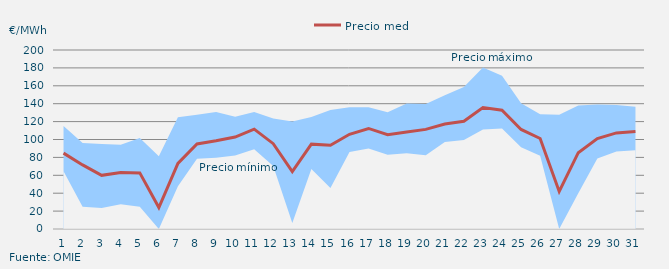
| Category | Precio medio |
|---|---|
| 1.0 | 84.788 |
| 2.0 | 71.594 |
| 3.0 | 59.958 |
| 4.0 | 63.108 |
| 5.0 | 62.688 |
| 6.0 | 24.049 |
| 7.0 | 73.377 |
| 8.0 | 95.079 |
| 9.0 | 98.516 |
| 10.0 | 102.714 |
| 11.0 | 111.58 |
| 12.0 | 95.333 |
| 13.0 | 64.247 |
| 14.0 | 94.796 |
| 15.0 | 93.546 |
| 16.0 | 105.826 |
| 17.0 | 112.348 |
| 18.0 | 105.412 |
| 19.0 | 108.354 |
| 20.0 | 111.321 |
| 21.0 | 117.358 |
| 22.0 | 120.386 |
| 23.0 | 135.603 |
| 24.0 | 132.759 |
| 25.0 | 111.213 |
| 26.0 | 101.116 |
| 27.0 | 41.99 |
| 28.0 | 85.272 |
| 29.0 | 100.95 |
| 30.0 | 107.375 |
| 31.0 | 108.982 |